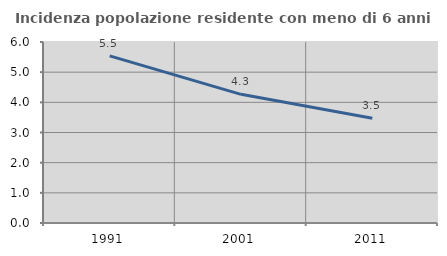
| Category | Incidenza popolazione residente con meno di 6 anni |
|---|---|
| 1991.0 | 5.538 |
| 2001.0 | 4.266 |
| 2011.0 | 3.475 |